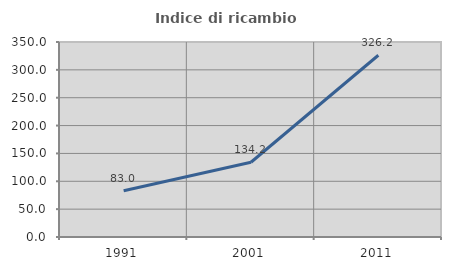
| Category | Indice di ricambio occupazionale  |
|---|---|
| 1991.0 | 83.014 |
| 2001.0 | 134.175 |
| 2011.0 | 326.217 |